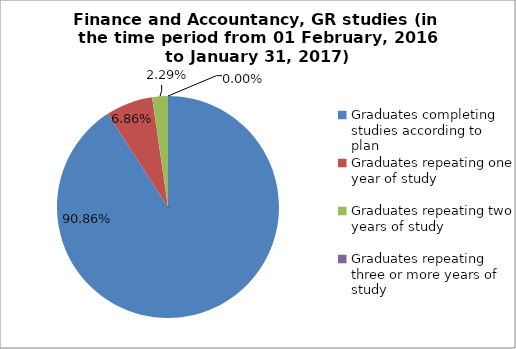
| Category | Series 0 |
|---|---|
| Graduates completing studies according to plan | 90.857 |
| Graduates repeating one year of study | 6.857 |
| Graduates repeating two years of study | 2.286 |
| Graduates repeating three or more years of study | 0 |